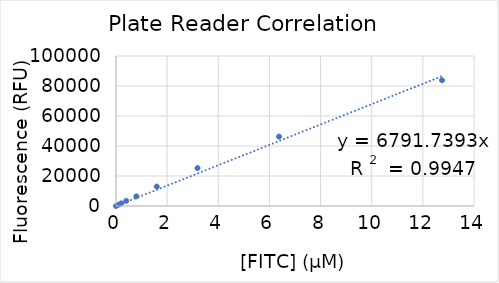
| Category | Background Subtract |
|---|---|
| 0.0 | 0 |
| 0.099609375 | 848.833 |
| 0.19921875 | 1740.5 |
| 0.3984375 | 3421.333 |
| 0.796875 | 6418.333 |
| 1.59375 | 12934 |
| 3.1875 | 25279.333 |
| 6.375 | 46269.333 |
| 12.75 | 83844.667 |